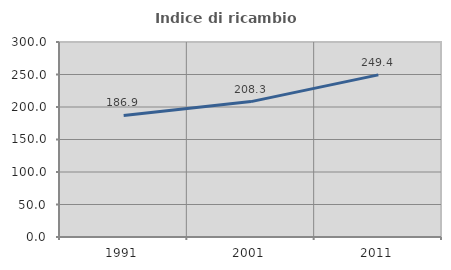
| Category | Indice di ricambio occupazionale  |
|---|---|
| 1991.0 | 186.928 |
| 2001.0 | 208.297 |
| 2011.0 | 249.388 |